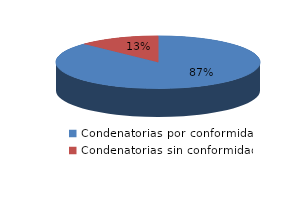
| Category | Series 0 |
|---|---|
| 0 | 379 |
| 1 | 56 |